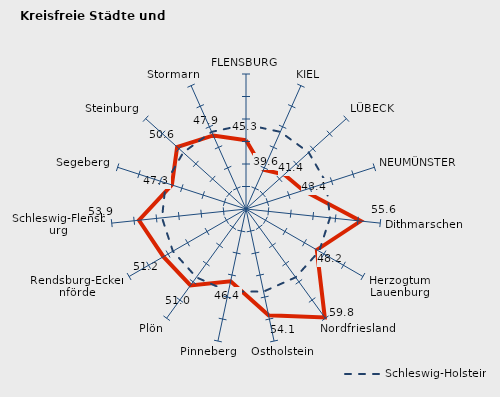
| Category | Kreise | Schleswig-Holstein |
|---|---|---|
| FLENSBURG | 45.278 | 48.765 |
| KIEL | 39.568 | 48.765 |
| LÜBECK | 41.446 | 48.765 |
| NEUMÜNSTER | 43.351 | 48.765 |
| Dithmarschen | 55.616 | 48.765 |
| Herzogtum Lauenburg | 48.175 | 48.765 |
| Nordfriesland | 59.783 | 48.765 |
| Ostholstein | 54.128 | 48.765 |
| Pinneberg | 46.416 | 48.765 |
| Plön | 50.99 | 48.765 |
| Rendsburg-Eckernförde | 51.199 | 48.765 |
| Schleswig-Flensburg | 53.91 | 48.765 |
| Segeberg | 47.313 | 48.765 |
| Steinburg | 50.591 | 48.765 |
| Stormarn | 47.892 | 48.765 |